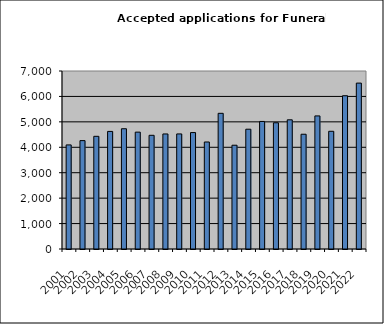
| Category | Series 1 |
|---|---|
| 2001.0 | 4093 |
| 2002.0 | 4262 |
| 2003.0 | 4431 |
| 2004.0 | 4624 |
| 2005.0 | 4729 |
| 2006.0 | 4596 |
| 2007.0 | 4471 |
| 2008.0 | 4524 |
| 2009.0 | 4525 |
| 2010.0 | 4579 |
| 2011.0 | 4208 |
| 2012.0 | 5336 |
| 2013.0 | 4081 |
| 2014.0 | 4711 |
| 2015.0 | 5016 |
| 2016.0 | 4964 |
| 2017.0 | 5080 |
| 2018.0 | 4513 |
| 2019.0 | 5234 |
| 2020.0 | 4629 |
| 2021.0 | 6027 |
| 2022.0 | 6524 |